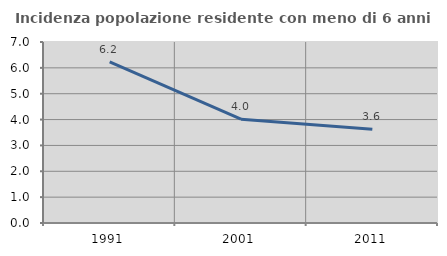
| Category | Incidenza popolazione residente con meno di 6 anni |
|---|---|
| 1991.0 | 6.236 |
| 2001.0 | 4.014 |
| 2011.0 | 3.621 |